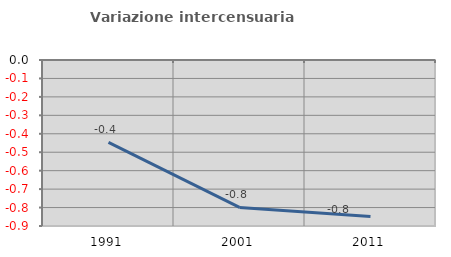
| Category | Variazione intercensuaria annua |
|---|---|
| 1991.0 | -0.446 |
| 2001.0 | -0.799 |
| 2011.0 | -0.848 |